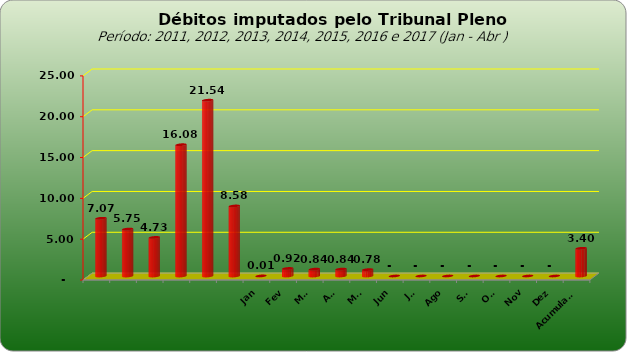
| Category |  7.073.154,74  |
|---|---|
|  | 7073154.74 |
|  | 5749129.25 |
|  | 4727033.51 |
|  | 16081820.48 |
|  | 21535723.6 |
|  | 8578266.09 |
| Jan | 7518 |
| Fev | 924330.96 |
| Mar | 840781.7 |
| Abr | 842058.28 |
| Mai | 780852.82 |
| Jun | 0 |
| Jul | 0 |
| Ago | 0 |
| Set | 0 |
| Out | 0 |
| Nov | 0 |
| Dez | 0 |
| Acumulado | 3395541.76 |